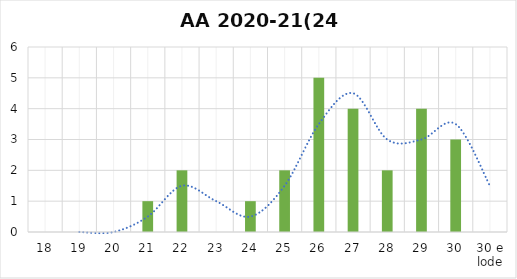
| Category | Series 0 |
|---|---|
| 18 | 0 |
| 19 | 0 |
| 20 | 0 |
| 21 | 1 |
| 22 | 2 |
| 23 | 0 |
| 24 | 1 |
| 25 | 2 |
| 26 | 5 |
| 27 | 4 |
| 28 | 2 |
| 29 | 4 |
| 30 | 3 |
| 30 e lode | 0 |